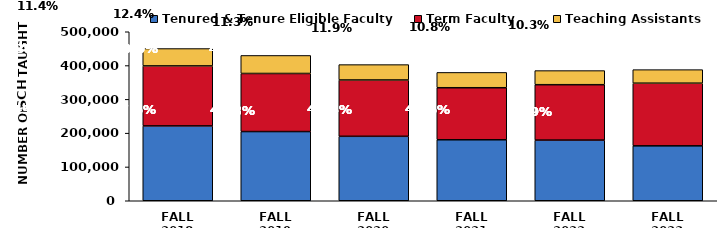
| Category | Tenured & Tenure Eligible Faculty | Term Faculty | Teaching Assistants |
|---|---|---|---|
| FALL 2018 | 221462.6 | 177514.4 | 51337.1 |
| FALL 2019 | 204740.7 | 171799.4 | 53370.6 |
| FALL 2020 | 190649.5 | 166677.7 | 45457.7 |
| FALL 2021 | 180420.7 | 153978.3 | 45299.9 |
| FALL 2022 | 179478.38 | 163866.785 | 41758.87 |
| FALL 2023 | 162486.251 | 185363.049 | 40051.127 |